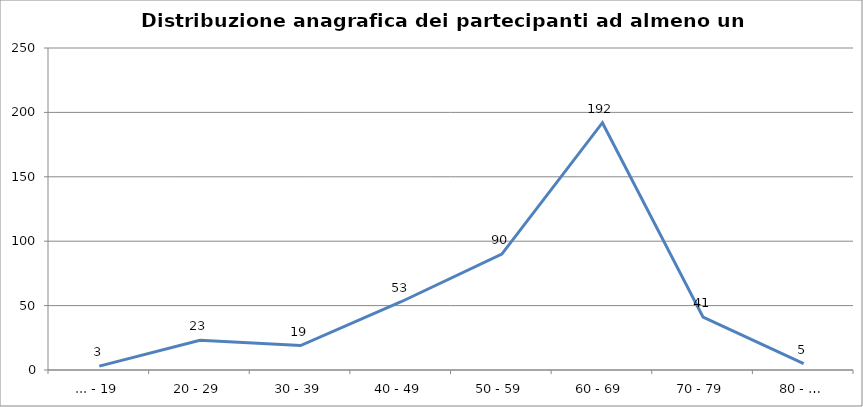
| Category | Nr. Tesserati |
|---|---|
| ... - 19 | 3 |
| 20 - 29 | 23 |
| 30 - 39 | 19 |
| 40 - 49 | 53 |
| 50 - 59 | 90 |
| 60 - 69 | 192 |
| 70 - 79 | 41 |
| 80 - … | 5 |